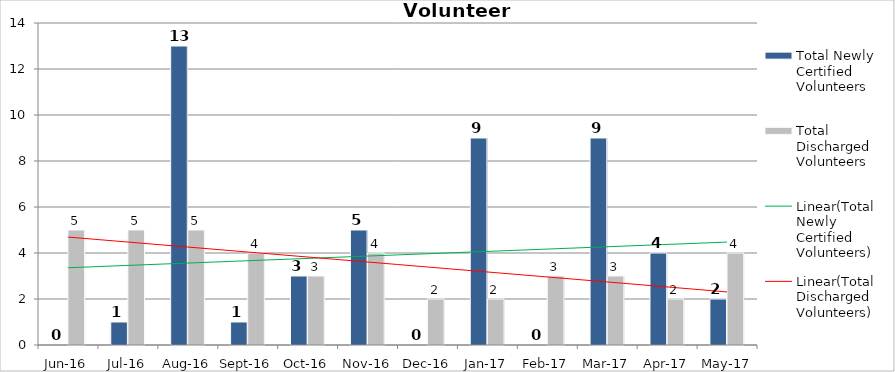
| Category | Total Newly Certified Volunteers | Total Discharged Volunteers |
|---|---|---|
| Jun-16 | 0 | 5 |
| Jul-16 | 1 | 5 |
| Aug-16 | 13 | 5 |
| Sep-16 | 1 | 4 |
| Oct-16 | 3 | 3 |
| Nov-16 | 5 | 4 |
| Dec-16 | 0 | 2 |
| Jan-17 | 9 | 2 |
| Feb-17 | 0 | 3 |
| Mar-17 | 9 | 3 |
| Apr-17 | 4 | 2 |
| May-17 | 2 | 4 |